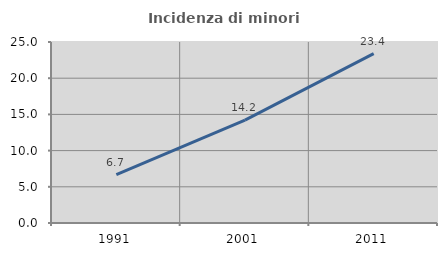
| Category | Incidenza di minori stranieri |
|---|---|
| 1991.0 | 6.667 |
| 2001.0 | 14.201 |
| 2011.0 | 23.391 |